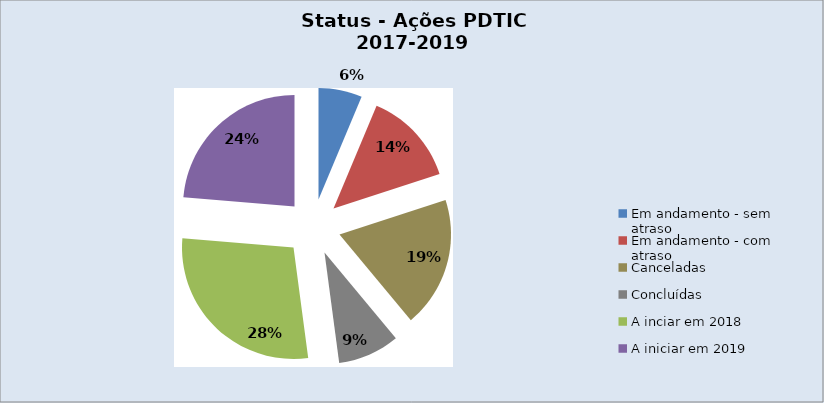
| Category | Series 0 |
|---|---|
| Em andamento - sem atraso | 12 |
| Em andamento - com atraso | 26 |
| Canceladas | 36 |
| Concluídas | 17 |
| A inciar em 2018 | 54 |
| A iniciar em 2019 | 45 |